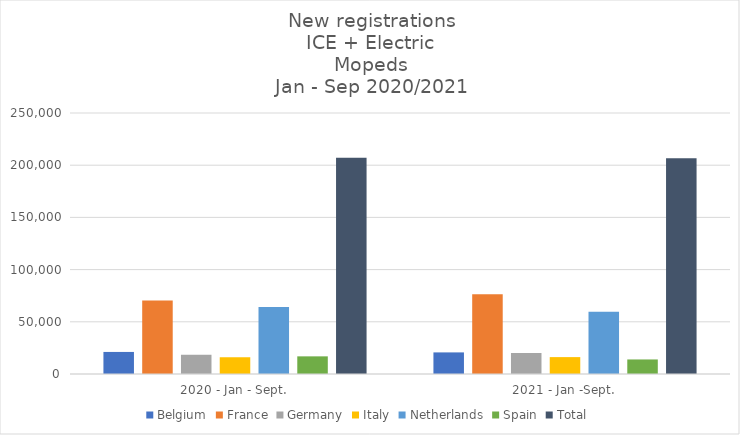
| Category | Belgium | France | Germany | Italy | Netherlands | Spain | Total |
|---|---|---|---|---|---|---|---|
| 2020 - Jan - Sept. | 21127 | 70479 | 18430 | 16042 | 64175 | 16906 | 207159 |
| 2021 - Jan -Sept. | 20689 | 76313 | 20100 | 16178 | 59537 | 13934 | 206751 |